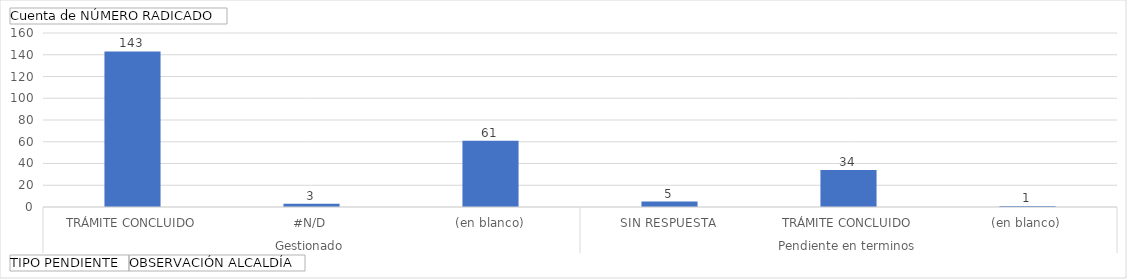
| Category | Total |
|---|---|
| 0 | 143 |
| 1 | 3 |
| 2 | 61 |
| 3 | 5 |
| 4 | 34 |
| 5 | 1 |